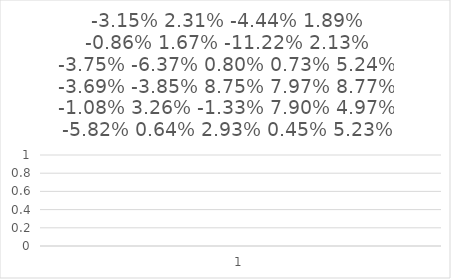
| Category | -3.15% |
|---|---|
| 0 | 0 |